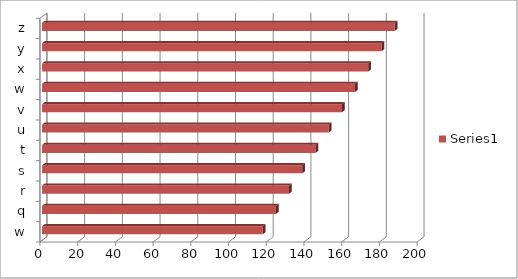
| Category | Series 0 |
|---|---|
| w | 117 |
| q | 124 |
| r | 131 |
| s | 138 |
| t | 145 |
| u | 152 |
| v | 159 |
| w | 166 |
| x | 173 |
| y | 180 |
| z | 187 |